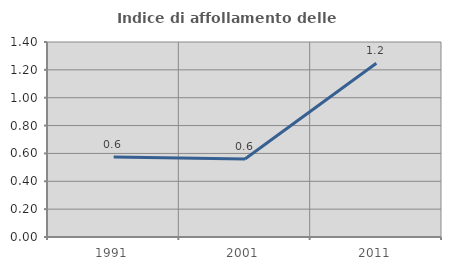
| Category | Indice di affollamento delle abitazioni  |
|---|---|
| 1991.0 | 0.575 |
| 2001.0 | 0.56 |
| 2011.0 | 1.247 |